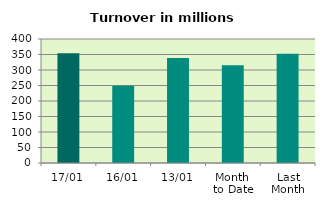
| Category | Series 0 |
|---|---|
| 17/01 | 353.7 |
| 16/01 | 248.974 |
| 13/01 | 338.575 |
| Month 
to Date | 315.478 |
| Last
Month | 352.227 |